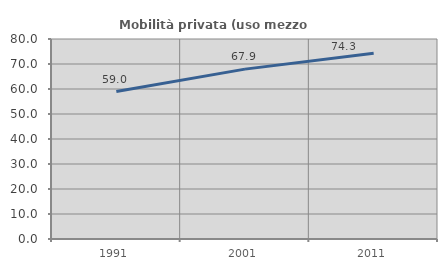
| Category | Mobilità privata (uso mezzo privato) |
|---|---|
| 1991.0 | 58.993 |
| 2001.0 | 67.946 |
| 2011.0 | 74.275 |